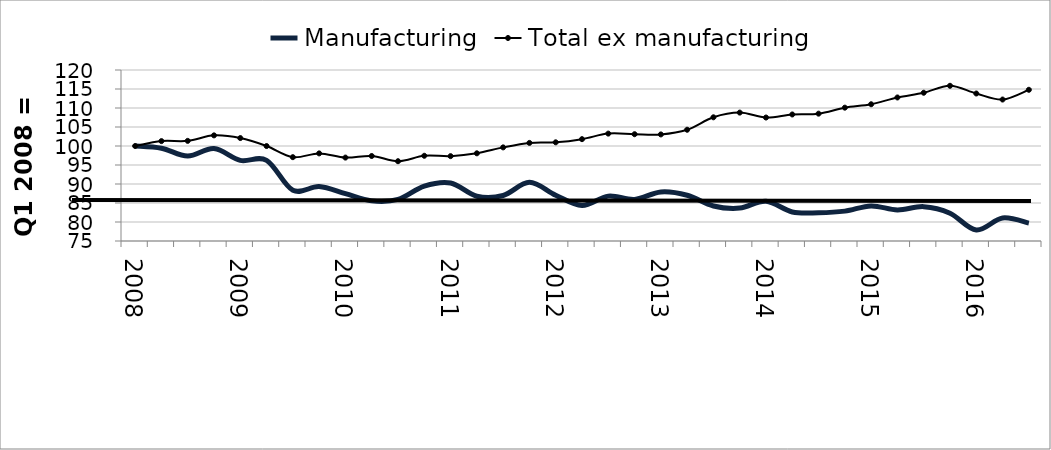
| Category | Manufacturing | Total ex manufacturing |
|---|---|---|
| 2008.0 | 100 | 100 |
| nan | 99.417 | 101.288 |
| nan | 97.35 | 101.35 |
| nan | 99.331 | 102.797 |
| 2009.0 | 96.219 | 102.088 |
| nan | 96.233 | 99.988 |
| nan | 88.354 | 97.061 |
| nan | 89.341 | 98.054 |
| 2010.0 | 87.449 | 96.952 |
| nan | 85.562 | 97.368 |
| nan | 85.95 | 95.996 |
| nan | 89.451 | 97.427 |
| 2011.0 | 90.267 | 97.332 |
| nan | 86.783 | 98.076 |
| nan | 86.979 | 99.637 |
| nan | 90.436 | 100.814 |
| 2012.0 | 87.038 | 100.971 |
| nan | 84.37 | 101.801 |
| nan | 86.807 | 103.262 |
| nan | 85.941 | 103.104 |
| 2013.0 | 87.917 | 103.046 |
| nan | 87.047 | 104.275 |
| nan | 84.224 | 107.552 |
| nan | 83.661 | 108.792 |
| 2014.0 | 85.453 | 107.495 |
| nan | 82.633 | 108.298 |
| nan | 82.438 | 108.513 |
| nan | 82.859 | 110.088 |
| 2015.0 | 84.242 | 110.985 |
| nan | 83.173 | 112.771 |
| nan | 84.038 | 114.014 |
| nan | 82.326 | 115.845 |
| 2016.0 | 77.899 | 113.817 |
| nan | 81.064 | 112.227 |
| nan | 79.714 | 114.791 |